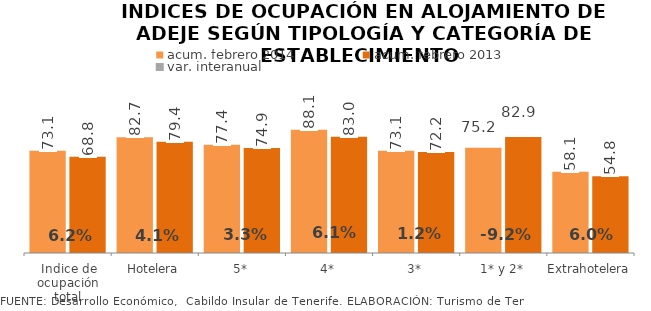
| Category | acum. febrero 2014 | acum. febrero 2013 |
|---|---|---|
| Indice de ocupación total | 73.111 | 68.813 |
| Hotelera | 82.72 | 79.443 |
| 5* | 77.4 | 74.925 |
| 4* | 88.097 | 83.037 |
| 3* | 73.067 | 72.184 |
| 1* y 2* | 75.245 | 82.855 |
| Extrahotelera | 58.111 | 54.839 |